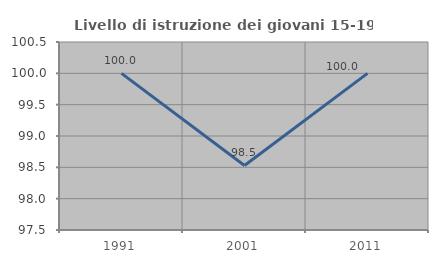
| Category | Livello di istruzione dei giovani 15-19 anni |
|---|---|
| 1991.0 | 100 |
| 2001.0 | 98.529 |
| 2011.0 | 100 |